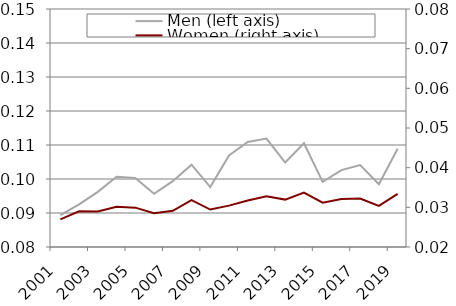
| Category | Men (left axis) |
|---|---|
| 2001.0 | 0.089 |
| 2002.0 | 0.093 |
| 2003.0 | 0.096 |
| 2004.0 | 0.101 |
| 2005.0 | 0.1 |
| 2006.0 | 0.096 |
| 2007.0 | 0.099 |
| 2008.0 | 0.104 |
| 2009.0 | 0.098 |
| 2010.0 | 0.107 |
| 2011.0 | 0.111 |
| 2012.0 | 0.112 |
| 2013.0 | 0.105 |
| 2014.0 | 0.111 |
| 2015.0 | 0.099 |
| 2016.0 | 0.103 |
| 2017.0 | 0.104 |
| 2018.0 | 0.098 |
| 2019.0 | 0.109 |